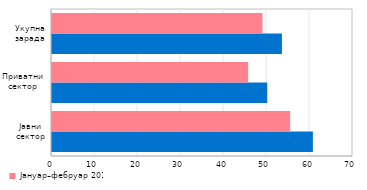
| Category | Јануар–фебруар 2019. | Јануар–фебруар 2018. |
|---|---|---|
| Јавни сектор | 60.67 | 55.384 |
| Приватни сектор | 50.051 | 45.615 |
| Укупна зарада | 53.474 | 48.934 |